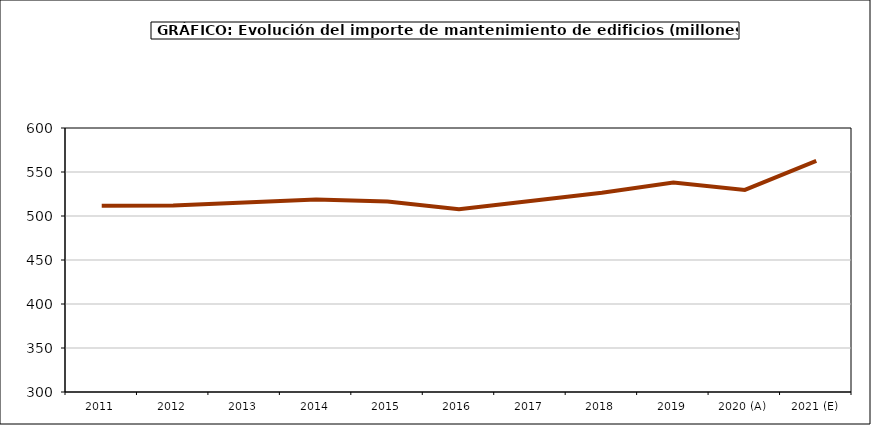
| Category | mantenimiento |
|---|---|
| 2011 | 511.585 |
| 2012 | 512.04 |
| 2013 | 515.387 |
| 2014 | 518.885 |
| 2015 | 516.507 |
| 2016 | 507.665 |
| 2017 | 516.979 |
| 2018 | 526.443 |
| 2019 | 537.976 |
| 2020 (A) | 529.672 |
| 2021 (E) | 562.583 |